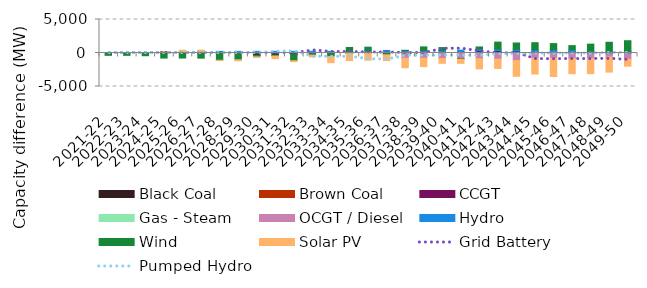
| Category | Black Coal | Brown Coal | CCGT | Gas - Steam | OCGT / Diesel | Hydro | Wind | Solar PV |
|---|---|---|---|---|---|---|---|---|
| 2021-22 | 0 | 0 | 0 | 0 | 0 | 0 | -348.633 | 0 |
| 2022-23 | 0 | 0 | 0 | 0 | 0 | 0 | -348.633 | 0 |
| 2023-24 | 0 | 0 | 0 | 0 | 0 | 0 | -406.152 | 0 |
| 2024-25 | 43.736 | 148.604 | 0 | 0 | 0 | 0 | -755.16 | 0 |
| 2025-26 | 56.205 | 161.043 | 0 | 0 | 0 | 0 | -749.719 | 200.274 |
| 2026-27 | -52.911 | 234.543 | 0 | 0 | 0 | 0 | -713.677 | 200.274 |
| 2027-28 | -50.726 | -0.001 | 0 | 0 | 0 | 250 | -1028.209 | -41.261 |
| 2028-29 | -50.727 | -0.001 | 0 | 0 | 0 | 250 | -960.259 | -148.15 |
| 2029-30 | -334.901 | -0.001 | 0 | 0 | 0 | 250 | -234.07 | -30.224 |
| 2030-31 | -334.901 | -0.001 | 0 | 0 | 0 | 250 | -118.354 | -388.331 |
| 2031-32 | -240.701 | -0.001 | 0 | 0 | 0 | 250 | -910.922 | -128.092 |
| 2032-33 | -159.292 | -0.001 | 0 | 0 | 0 | 250 | -162.77 | -253.295 |
| 2033-34 | -91.384 | -0.001 | 0 | 0 | 0 | 250 | -440.171 | -909.756 |
| 2034-35 | -91.384 | -0.001 | 0 | 0 | 0 | 250 | 580.065 | -1046.707 |
| 2035-36 | 127.032 | -0.001 | 0 | 0 | -32.68 | 250 | 486.683 | -1046.707 |
| 2036-37 | 129.137 | -0.001 | 0 | 0 | -32.68 | 250 | -242.107 | -859.302 |
| 2037-38 | 129.139 | -0.001 | 0 | 0 | -781.274 | 250 | 21.996 | -1424.955 |
| 2038-39 | 129.139 | -0.001 | 0 | 0 | -781.274 | 250 | 531.306 | -1247.267 |
| 2039-40 | 129.139 | -0.001 | 0 | 0 | -812.108 | 250 | 428.797 | -723.558 |
| 2040-41 | 177.92 | -0.001 | 0 | 0 | -812.108 | 250 | -106.209 | -623.437 |
| 2041-42 | 345.032 | -0.001 | 0 | 0 | -847.701 | 250 | 306.232 | -1521.123 |
| 2042-43 | 345.032 | -0.001 | 0 | 0 | -912.949 | 250 | 1031.152 | -1378.934 |
| 2043-44 | 298.08 | -0.001 | 0 | 0 | -1123.989 | 250 | 948.187 | -2354.969 |
| 2044-45 | 215.894 | -0.001 | 0 | 0 | -781.601 | 250 | 1072.329 | -2354.969 |
| 2045-46 | 215.894 | 0 | 0 | 0 | -781.601 | 250 | 935.998 | -2725.283 |
| 2046-47 | 215.894 | 0 | 0 | 0 | -823.87 | 250 | 633.362 | -2258.94 |
| 2047-48 | 0 | 0 | 0 | 0 | -823.87 | 250 | 1070.424 | -2258.94 |
| 2048-49 | 0 | 0 | 0 | 0 | -593.747 | 250 | 1351.737 | -2258.94 |
| 2049-50 | 0 | 0 | 0 | 0 | -925.01 | 250 | 1583.332 | -1044.707 |